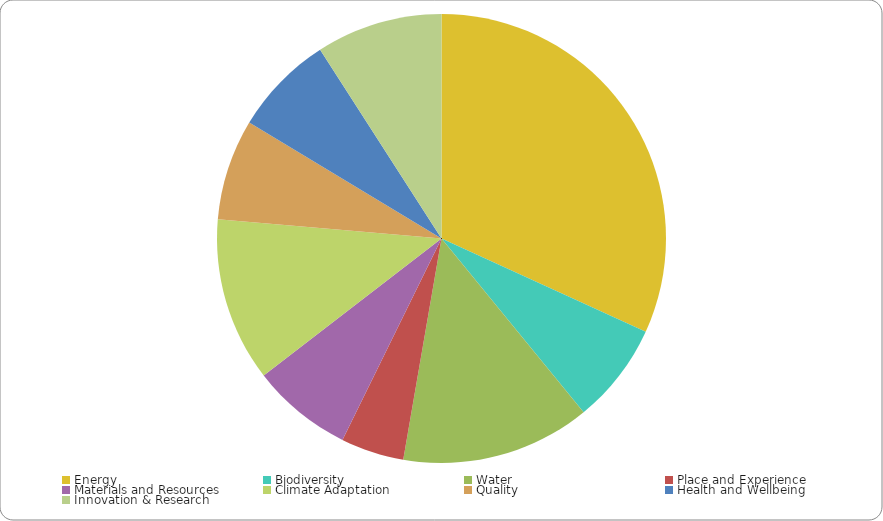
| Category | Series 0 |
|---|---|
| Energy | 0.35 |
| Biodiversity | 0.08 |
| Water  | 0.15 |
| Place and Experience | 0.05 |
| Materials and Resources | 0.08 |
| Climate Adaptation | 0.13 |
| Quality | 0.08 |
| Health and Wellbeing | 0.08 |
| Innovation & Research | 0.1 |